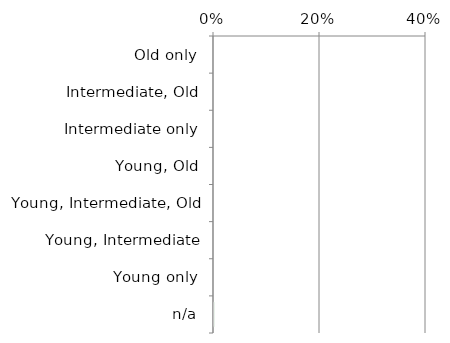
| Category | Not determinable |
|---|---|
| n/a | 0.001 |
| Young only | 0 |
| Young, Intermediate | 0 |
| Young, Intermediate, Old | 0 |
| Young, Old | 0 |
| Intermediate only | 0 |
| Intermediate, Old | 0 |
| Old only | 0 |